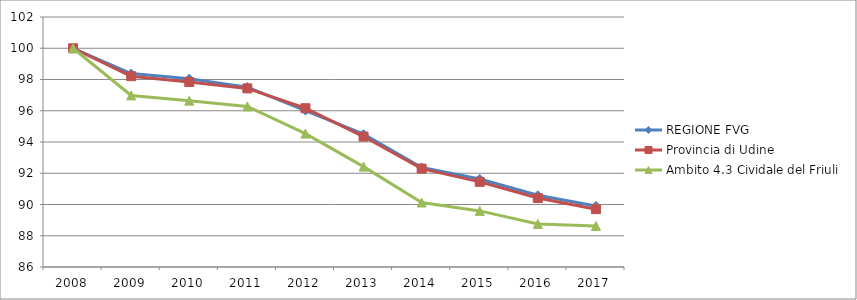
| Category | REGIONE FVG | Provincia di Udine | Ambito 4.3 Cividale del Friuli |
|---|---|---|---|
| 2008.0 | 100 | 100 | 100 |
| 2009.0 | 98.378 | 98.213 | 96.981 |
| 2010.0 | 98.049 | 97.839 | 96.648 |
| 2011.0 | 97.515 | 97.431 | 96.277 |
| 2012.0 | 96.012 | 96.162 | 94.536 |
| 2013.0 | 94.5 | 94.348 | 92.425 |
| 2014.0 | 92.37 | 92.296 | 90.128 |
| 2015.0 | 91.632 | 91.451 | 89.591 |
| 2016.0 | 90.595 | 90.414 | 88.757 |
| 2017.0 | 89.908 | 89.702 | 88.628 |